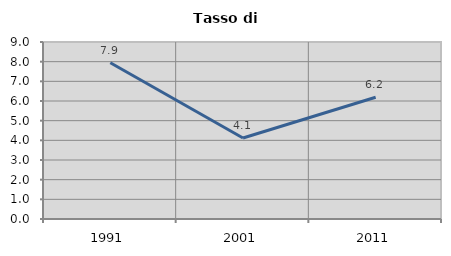
| Category | Tasso di disoccupazione   |
|---|---|
| 1991.0 | 7.946 |
| 2001.0 | 4.119 |
| 2011.0 | 6.192 |